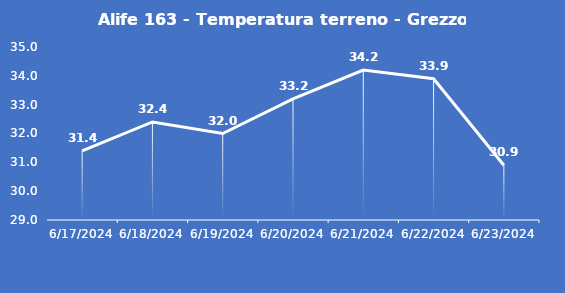
| Category | Alife 163 - Temperatura terreno - Grezzo (°C) |
|---|---|
| 6/17/24 | 31.4 |
| 6/18/24 | 32.4 |
| 6/19/24 | 32 |
| 6/20/24 | 33.2 |
| 6/21/24 | 34.2 |
| 6/22/24 | 33.9 |
| 6/23/24 | 30.9 |